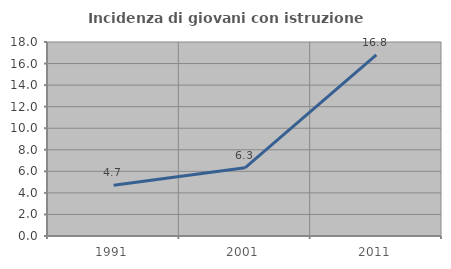
| Category | Incidenza di giovani con istruzione universitaria |
|---|---|
| 1991.0 | 4.704 |
| 2001.0 | 6.327 |
| 2011.0 | 16.801 |